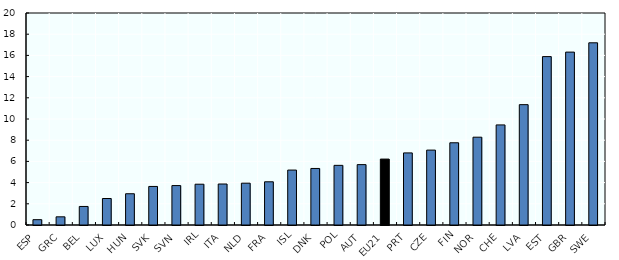
| Category | Retired and employed |
|---|---|
| ESP | 0.501 |
| GRC | 0.772 |
| BEL | 1.748 |
| LUX | 2.499 |
| HUN | 2.949 |
| SVK | 3.637 |
| SVN | 3.719 |
| IRL | 3.847 |
| ITA | 3.867 |
| NLD | 3.945 |
| FRA | 4.077 |
| ISL | 5.182 |
| DNK | 5.334 |
| POL | 5.627 |
| AUT | 5.697 |
| EU21 | 6.218 |
| PRT | 6.8 |
| CZE | 7.066 |
| FIN | 7.758 |
| NOR | 8.283 |
| CHE | 9.443 |
| LVA | 11.353 |
| EST | 15.887 |
| GBR | 16.311 |
| SWE | 17.189 |